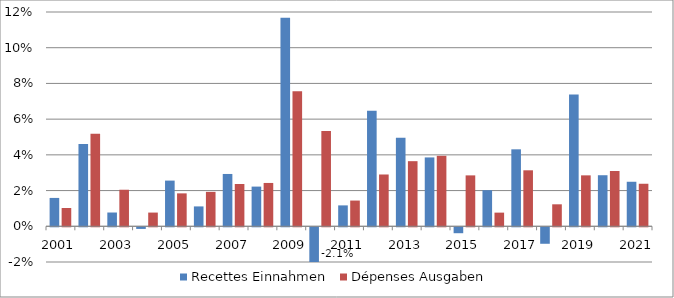
| Category | Recettes | Dépenses |
|---|---|---|
| 2001.0 | 0.016 | 0.01 |
| 2002.0 | 0.046 | 0.052 |
| 2003.0 | 0.008 | 0.02 |
| 2004.0 | -0.001 | 0.008 |
| 2005.0 | 0.026 | 0.018 |
| 2006.0 | 0.011 | 0.019 |
| 2007.0 | 0.029 | 0.024 |
| 2008.0 | 0.022 | 0.024 |
| 2009.0 | 0.117 | 0.076 |
| 2010.0 | -0.021 | 0.053 |
| 2011.0 | 0.012 | 0.014 |
| 2012.0 | 0.065 | 0.029 |
| 2013.0 | 0.05 | 0.036 |
| 2014.0 | 0.039 | 0.039 |
| 2015.0 | -0.003 | 0.029 |
| 2016.0 | 0.02 | 0.008 |
| 2017.0 | 0.043 | 0.031 |
| 2018.0 | -0.009 | 0.012 |
| 2019.0 | 0.074 | 0.029 |
| 2020.0 | 0.029 | 0.031 |
| 2021.0 | 0.025 | 0.024 |